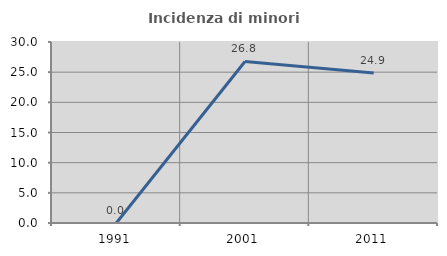
| Category | Incidenza di minori stranieri |
|---|---|
| 1991.0 | 0 |
| 2001.0 | 26.774 |
| 2011.0 | 24.859 |